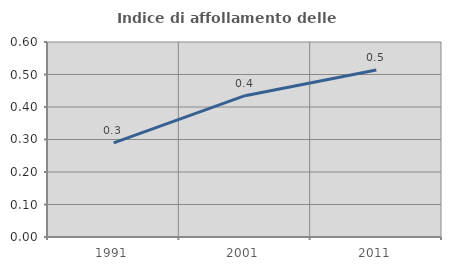
| Category | Indice di affollamento delle abitazioni  |
|---|---|
| 1991.0 | 0.29 |
| 2001.0 | 0.435 |
| 2011.0 | 0.514 |